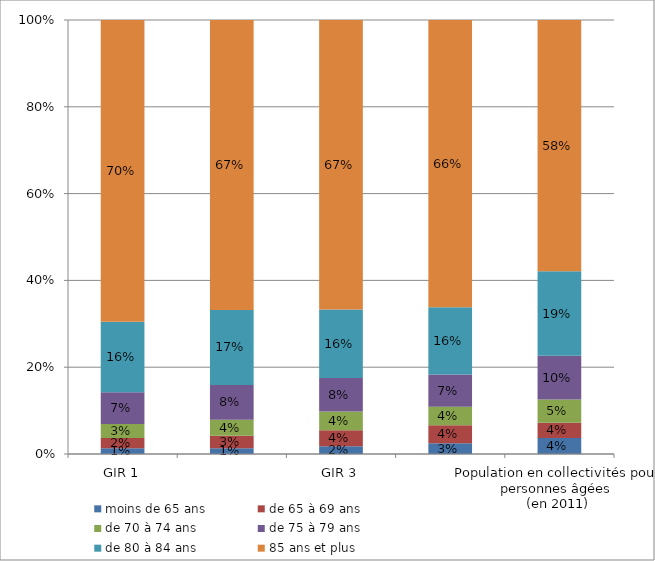
| Category | moins de 65 ans | de 65 à 69 ans | de 70 à 74 ans  | de 75 à 79 ans | de 80 à 84 ans | 85 ans et plus |
|---|---|---|---|---|---|---|
| GIR 1 | 0.013 | 0.024 | 0.032 | 0.073 | 0.163 | 0.695 |
|  GIR 2 | 0.013 | 0.029 | 0.037 | 0.08 | 0.173 | 0.668 |
| GIR 3 | 0.018 | 0.037 | 0.043 | 0.077 | 0.158 | 0.667 |
|  GIR 4 | 0.025 | 0.041 | 0.043 | 0.074 | 0.155 | 0.662 |
| Population en collectivités pour personnes âgées 
(en 2011) | 0.037 | 0.035 | 0.053 | 0.101 | 0.195 | 0.579 |